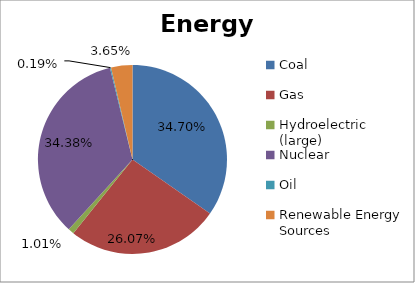
| Category | Energy Source |
|---|---|
| Coal | 0.347 |
| Gas | 0.261 |
| Hydroelectric (large) | 0.01 |
| Nuclear | 0.344 |
| Oil | 0.002 |
| Renewable Energy Sources | 0.036 |